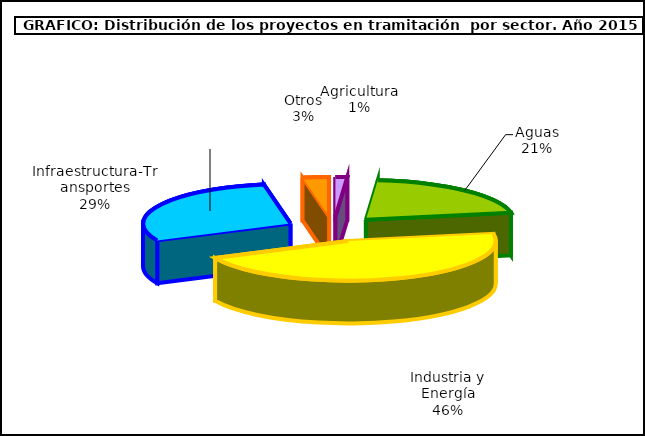
| Category | Series 0 |
|---|---|
| 0 | 4 |
| 1 | 65 |
| 2 | 143 |
| 3 | 91 |
| 4 | 9 |